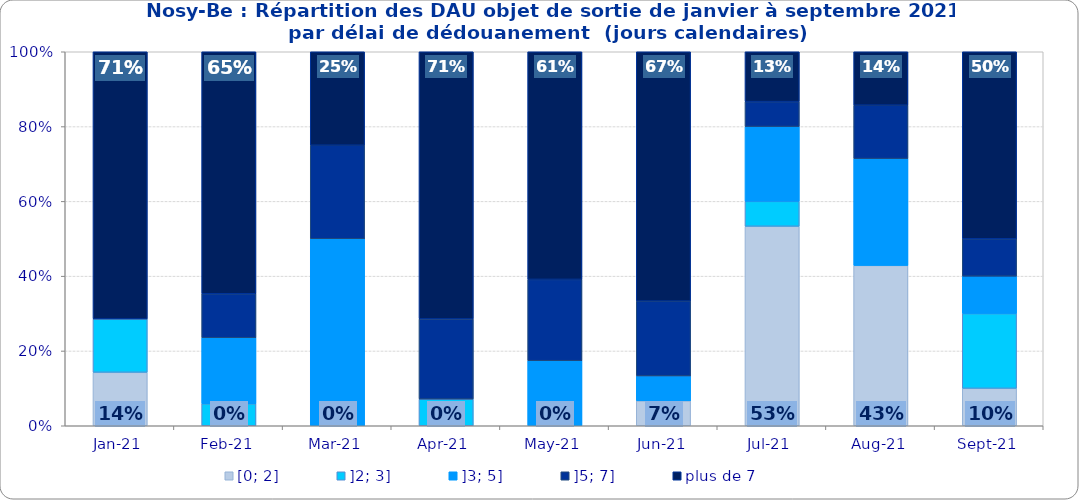
| Category | [0; 2] | ]2; 3] | ]3; 5] | ]5; 7] | plus de 7 |
|---|---|---|---|---|---|
| 2021-01-01 | 0.143 | 0.143 | 0 | 0 | 0.714 |
| 2021-02-01 | 0 | 0.059 | 0.176 | 0.118 | 0.647 |
| 2021-03-01 | 0 | 0 | 0.5 | 0.25 | 0.25 |
| 2021-04-01 | 0 | 0.071 | 0 | 0.214 | 0.714 |
| 2021-05-01 | 0 | 0 | 0.174 | 0.217 | 0.609 |
| 2021-06-01 | 0.067 | 0 | 0.067 | 0.2 | 0.667 |
| 2021-07-01 | 0.533 | 0.067 | 0.2 | 0.067 | 0.133 |
| 2021-08-01 | 0.429 | 0 | 0.286 | 0.143 | 0.143 |
| 2021-09-01 | 0.1 | 0.2 | 0.1 | 0.1 | 0.5 |